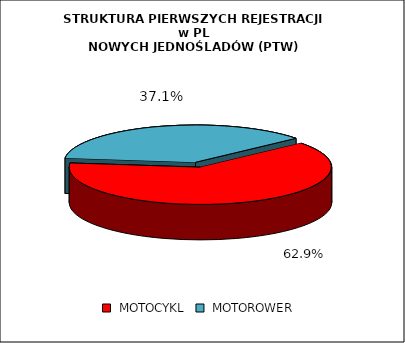
| Category | RAZEM |
|---|---|
|  MOTOCYKL  | 0.629 |
|  MOTOROWER  | 0.371 |